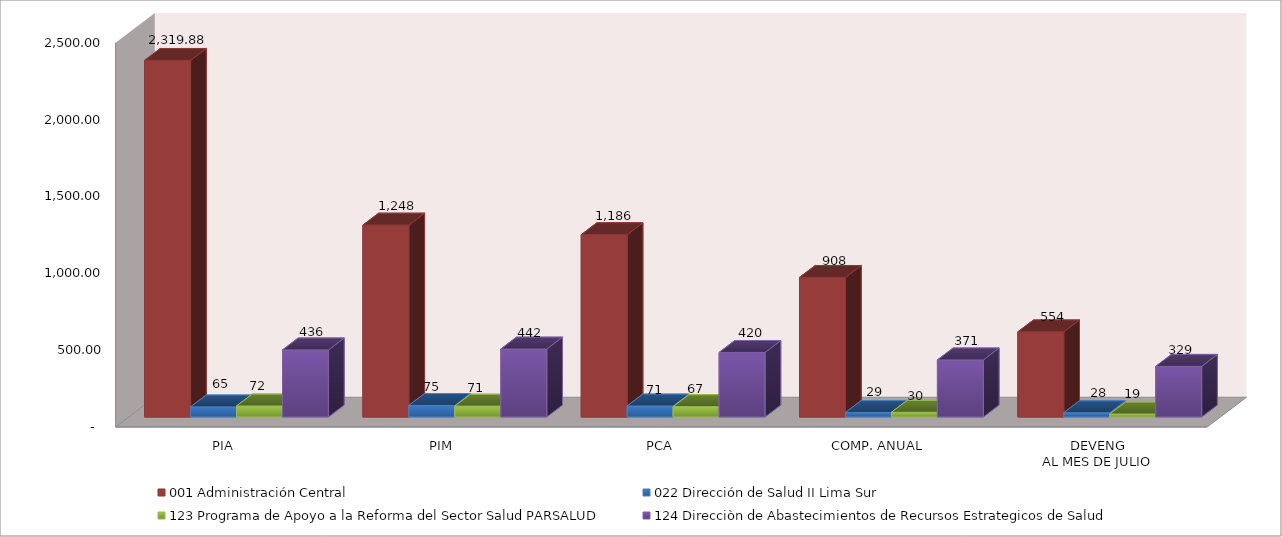
| Category | 001 Administración Central | 022 Dirección de Salud II Lima Sur | 123 Programa de Apoyo a la Reforma del Sector Salud PARSALUD | 124 Direcciòn de Abastecimientos de Recursos Estrategicos de Salud |
|---|---|---|---|---|
| PIA | 2319.877 | 65.372 | 71.532 | 436.35 |
| PIM | 1248.28 | 75.13 | 70.737 | 441.991 |
| PCA | 1185.866 | 71.373 | 67.2 | 419.891 |
| COMP. ANUAL | 907.985 | 28.951 | 30.378 | 371.287 |
| DEVENG
AL MES DE JULIO | 553.676 | 27.591 | 19.108 | 329.414 |